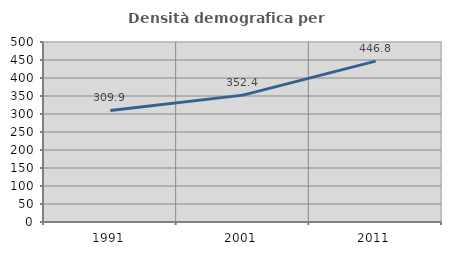
| Category | Densità demografica |
|---|---|
| 1991.0 | 309.94 |
| 2001.0 | 352.446 |
| 2011.0 | 446.834 |